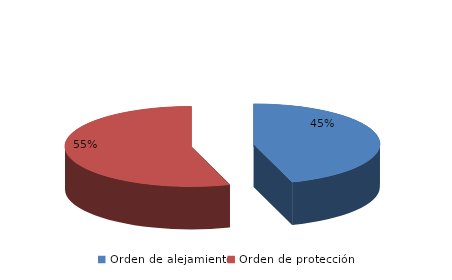
| Category | Series 0 |
|---|---|
| Orden de alejamiento | 146 |
| Orden de protección | 178 |